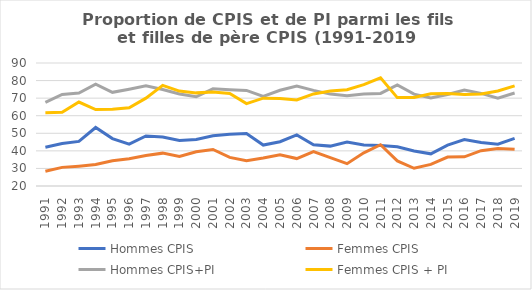
| Category | Hommes CPIS | Femmes CPIS | Hommes CPIS+PI | Femmes CPIS + PI |
|---|---|---|---|---|
| 1991.0 | 42.1 | 28.4 | 67.6 | 61.7 |
| 1992.0 | 44.2 | 30.6 | 72.1 | 62 |
| 1993.0 | 45.4 | 31.3 | 72.9 | 67.8 |
| 1994.0 | 53.3 | 32.2 | 77.9 | 63.5 |
| 1995.0 | 47 | 34.4 | 73.3 | 63.7 |
| 1996.0 | 43.8 | 35.5 | 75.1 | 64.5 |
| 1997.0 | 48.5 | 37.4 | 77.1 | 70 |
| 1998.0 | 47.9 | 38.7 | 74.9 | 77.3 |
| 1999.0 | 45.9 | 36.8 | 72.4 | 74 |
| 2000.0 | 46.5 | 39.5 | 70.8 | 73 |
| 2001.0 | 48.6 | 40.8 | 75.3 | 73.5 |
| 2002.0 | 49.4 | 36.3 | 74.8 | 72.7 |
| 2003.0 | 49.9 | 34.4 | 74.4 | 66.9 |
| 2004.0 | 43.3 | 35.9 | 71 | 70 |
| 2005.0 | 45.2 | 37.7 | 74.5 | 69.8 |
| 2006.0 | 49.1 | 35.6 | 76.9 | 69 |
| 2007.0 | 43.5 | 39.6 | 74.4 | 72.4 |
| 2008.0 | 42.7 | 36.1 | 72.3 | 74 |
| 2009.0 | 45 | 32.7 | 71.3 | 74.8 |
| 2010.0 | 43.3 | 38.9 | 72.3 | 77.7 |
| 2011.0 | 43.1 | 43.5 | 72.7 | 81.6 |
| 2012.0 | 42.3 | 34.3 | 77.5 | 70.3 |
| 2013.0 | 39.9 | 30.1 | 72.3 | 70.4 |
| 2014.0 | 38.3 | 32.3 | 70.1 | 72.5 |
| 2015.0 | 43.3 | 36.5 | 72.1 | 72.6 |
| 2016.0 | 46.4 | 36.6 | 74.6 | 72.1 |
| 2017.0 | 44.7 | 40.1 | 72.7 | 72.4 |
| 2018.0 | 43.8 | 41.4 | 70 | 74.1 |
| 2019.0 | 47.1 | 40.9 | 72.9 | 77 |